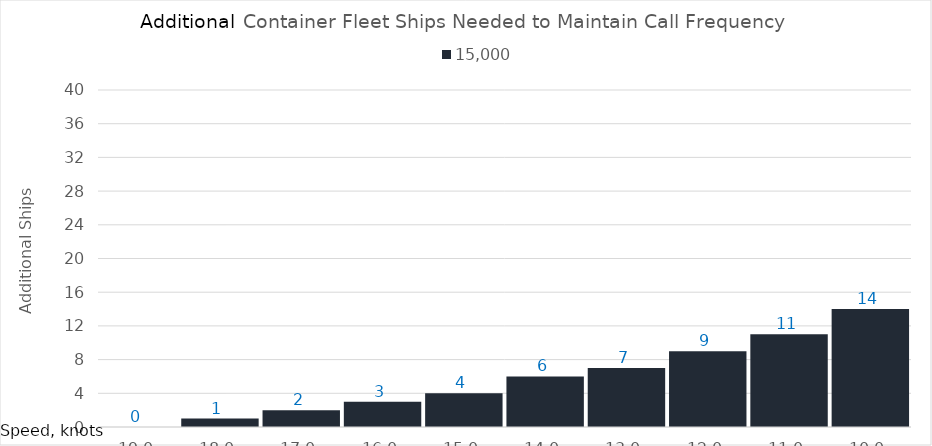
| Category | 15,000 |
|---|---|
| 19.0 | 0 |
| 18.0 | 1 |
| 17.0 | 2 |
| 16.0 | 3 |
| 15.0 | 4 |
| 14.0 | 6 |
| 13.0 | 7 |
| 12.0 | 9 |
| 11.0 | 11 |
| 10.0 | 14 |